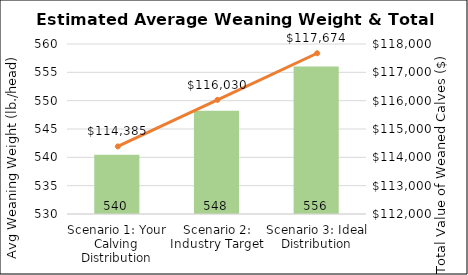
| Category | Average Weaning Weight |
|---|---|
| Scenario 1: Your Calving Distribution | 540.47 |
| Scenario 2: Industry Target | 548.24 |
| Scenario 3: Ideal Distribution | 556.01 |